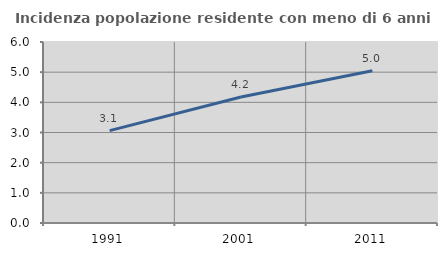
| Category | Incidenza popolazione residente con meno di 6 anni |
|---|---|
| 1991.0 | 3.063 |
| 2001.0 | 4.177 |
| 2011.0 | 5.048 |